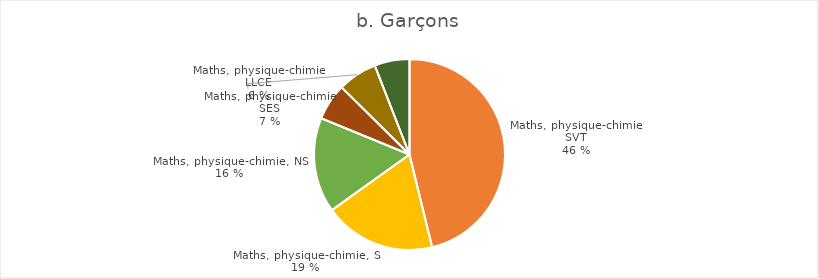
| Category | Garçons |
|---|---|
| Mathématiques, physique-chimie, SVT | 21329 |
| Mathématiques, physique-chimie, SI | 8737 |
| Mathématiques, physique-chimie, NSI | 7429 |
| Mathématiques, physique-chimie, LLCER | 2875 |
| Mathématiques, physique-chimie, SES | 3080 |
| Autres | 2733 |